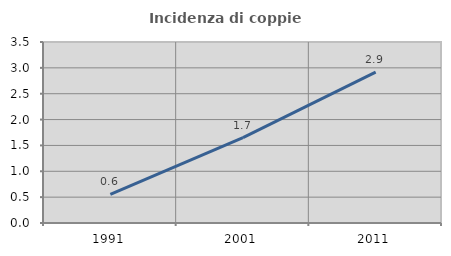
| Category | Incidenza di coppie miste |
|---|---|
| 1991.0 | 0.554 |
| 2001.0 | 1.651 |
| 2011.0 | 2.919 |